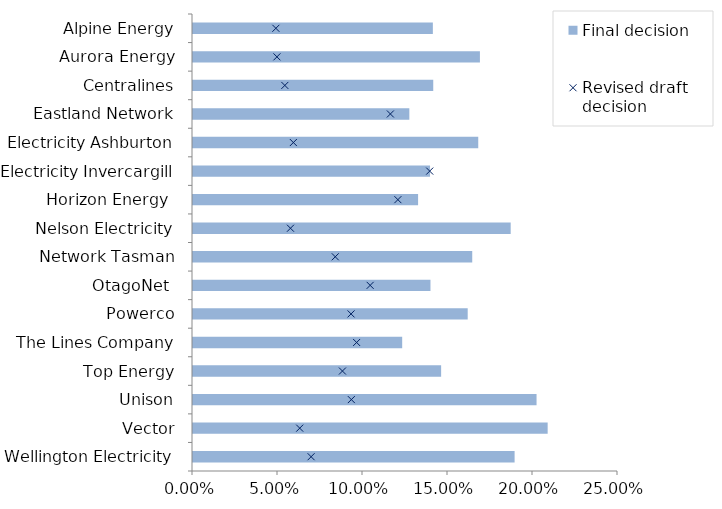
| Category | Final decision |
|---|---|
| Alpine Energy | 0.141 |
| Aurora Energy | 0.169 |
| Centralines | 0.141 |
| Eastland Network | 0.127 |
| Electricity Ashburton | 0.168 |
| Electricity Invercargill | 0.139 |
| Horizon Energy  | 0.132 |
| Nelson Electricity | 0.187 |
| Network Tasman | 0.164 |
| OtagoNet  | 0.14 |
| Powerco | 0.162 |
| The Lines Company | 0.123 |
| Top Energy | 0.146 |
| Unison | 0.202 |
| Vector | 0.209 |
| Wellington Electricity | 0.189 |